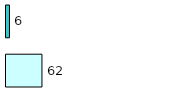
| Category | Series 0 | Series 1 |
|---|---|---|
| 0 | 62 | 6 |